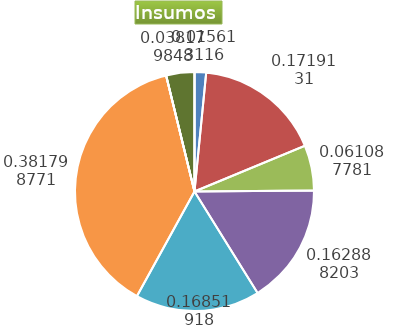
| Category | Series 0 |
|---|---|
| Control arvenses | 271244 |
| Control fitosanitario | 2986617 |
| Cosecha y beneficio | 1061267.606 |
| Fertilización | 2829829 |
| Instalación | 2927655 |
| Otros | 6632925 |
| Podas | 0 |
| Riego | 0 |
| Transporte | 663292 |
| Tutorado | 0 |